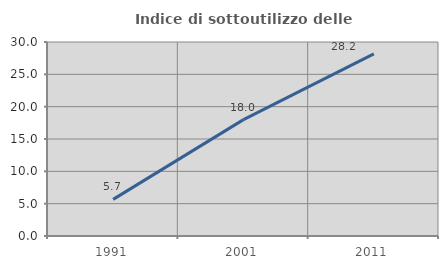
| Category | Indice di sottoutilizzo delle abitazioni  |
|---|---|
| 1991.0 | 5.66 |
| 2001.0 | 18 |
| 2011.0 | 28.169 |